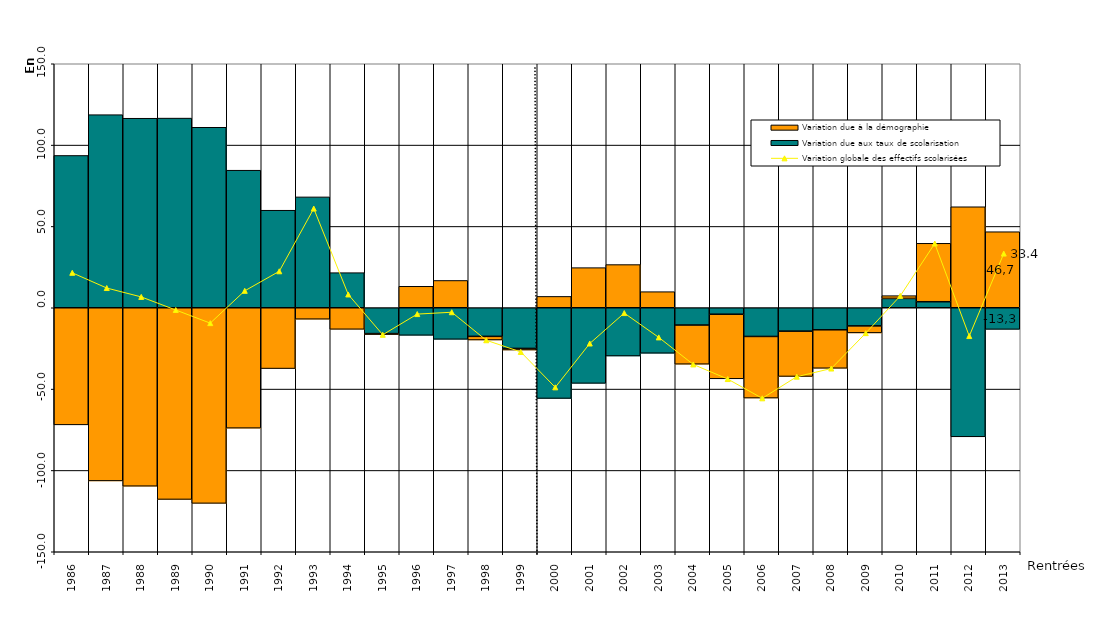
| Category | Variation due aux taux de scolarisation | Variation due à la démographie |
|---|---|---|
| 1986.0 | 93.628 | -71.995 |
| 1987.0 | 118.703 | -106.43 |
| 1988.0 | 116.515 | -109.701 |
| 1989.0 | 116.596 | -117.834 |
| 1990.0 | 110.957 | -120.261 |
| 1991.0 | 84.565 | -74.009 |
| 1992.0 | 59.961 | -37.39 |
| 1993.0 | 68.151 | -7.022 |
| 1994.0 | 21.576 | -13.249 |
| 1995.0 | -15.892 | -0.557 |
| 1996.0 | -16.943 | 13.201 |
| 1997.0 | -19.397 | 16.785 |
| 1998.0 | -17.587 | -2.23 |
| 1999.0 | -25 | -1 |
| 2000.0 | -55.759 | 6.974 |
| 2001.0 | -46.489 | 24.661 |
| 2002.0 | -29.666 | 26.542 |
| 2003.0 | -27.964 | 9.89 |
| 2004.0 | -10.634 | -24.054 |
| 2005.0 | -3.973 | -39.704 |
| 2006.0 | -17.64 | -37.881 |
| 2007.0 | -14.384 | -27.844 |
| 2008.0 | -13.55 | -23.661 |
| 2009.0 | -11.17 | -4.282 |
| 2010.0 | 5.739 | 1.7 |
| 2011.0 | 3.701 | 35.925 |
| 2012.0 | -79.341 | 62.089 |
| 2013.0 | -13.294 | 46.742 |